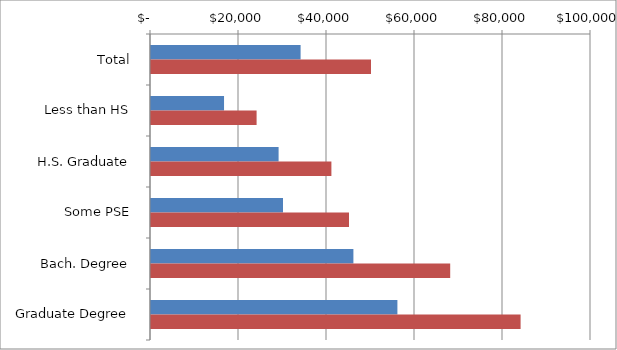
| Category | Series 0 | Series 1 |
|---|---|---|
| Total | 34000 | 50000 |
|  Less than HS  | 16600 | 24000 |
|  H.S. Graduate  | 29000 | 41000 |
|  Some PSE  | 30000 | 45000 |
|  Bach. Degree  | 46000 | 68000 |
|  Graduate Degree  | 56000 | 84000 |